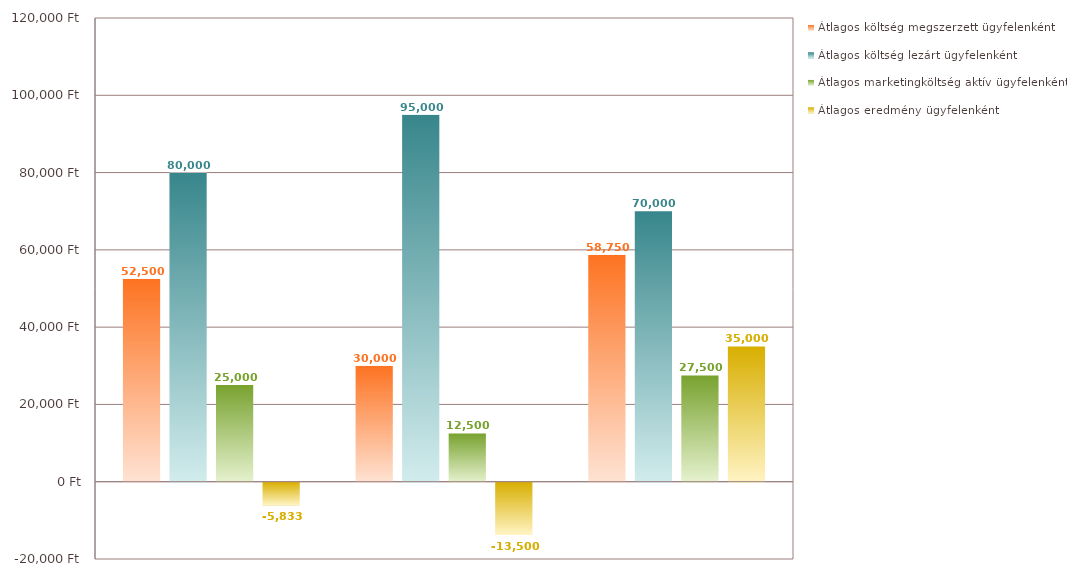
| Category | Átlagos költség megszerzett ügyfelenként | Átlagos költség lezárt ügyfelenként | Átlagos marketingköltség aktív ügyfelenként | Átlagos eredmény ügyfelenként |
|---|---|---|---|---|
|  | 52500 | 80000 | 25000 | -5833.333 |
|  | 30000 | 95000 | 12500 | -13500 |
|  | 58750 | 70000 | 27500 | 35000 |